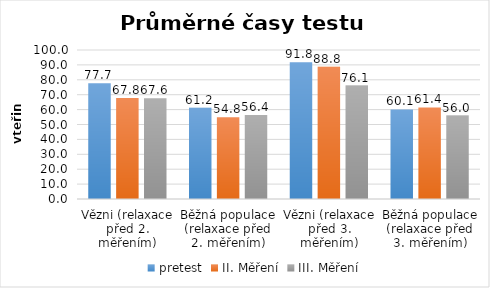
| Category | pretest | II. Měření | III. Měření |
|---|---|---|---|
| Vězni (relaxace před 2. měřením) | 77.677 | 67.775 | 67.565 |
| Běžná populace (relaxace před 2. měřením) | 61.165 | 54.85 | 56.366 |
| Vězni (relaxace před 3. měřením) | 91.791 | 88.832 | 76.109 |
| Běžná populace (relaxace před 3. měřením) | 60.127 | 61.442 | 55.967 |